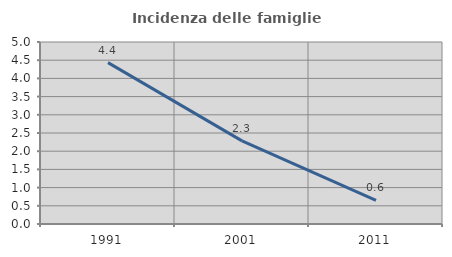
| Category | Incidenza delle famiglie numerose |
|---|---|
| 1991.0 | 4.433 |
| 2001.0 | 2.284 |
| 2011.0 | 0.646 |